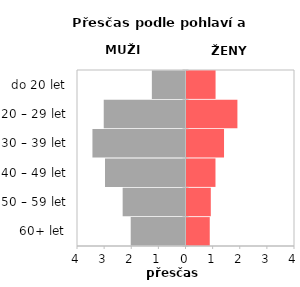
| Category | Přesčas |
|---|---|
| 60+ let | 0.857 |
| 50 – 59 let | 0.896 |
| 40 – 49 let | 1.068 |
| 30 – 39 let | 1.384 |
| 20 – 29 let | 1.877 |
| do 20 let | 1.071 |